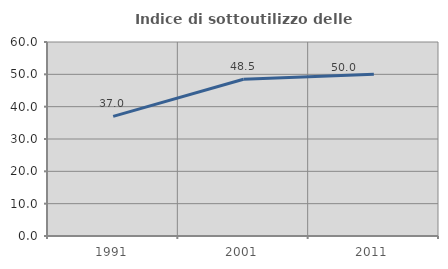
| Category | Indice di sottoutilizzo delle abitazioni  |
|---|---|
| 1991.0 | 36.991 |
| 2001.0 | 48.459 |
| 2011.0 | 50 |